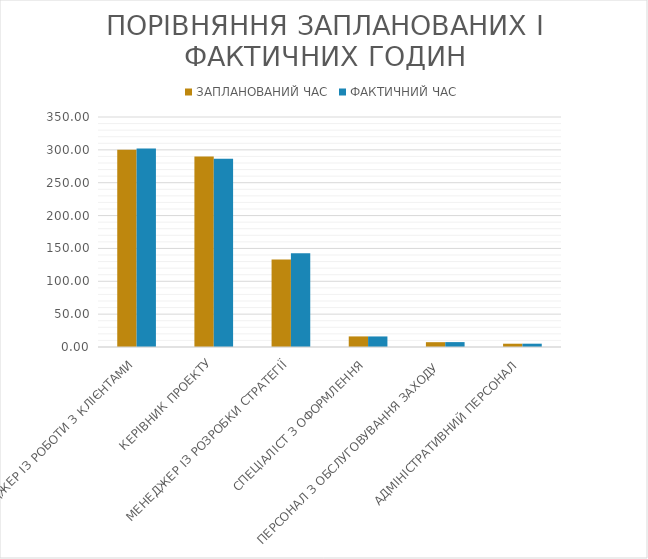
| Category | ЗАПЛАНОВАНИЙ ЧАС | ФАКТИЧНИЙ ЧАС |
|---|---|---|
| МЕНЕДЖЕР ІЗ РОБОТИ З КЛІЄНТАМИ | 300 | 302 |
| КЕРІВНИК ПРОЕКТУ | 290 | 286.333 |
| МЕНЕДЖЕР ІЗ РОЗРОБКИ СТРАТЕГІЇ | 133.333 | 142.5 |
| СПЕЦІАЛІСТ З ОФОРМЛЕННЯ | 16.111 | 16.056 |
| ПЕРСОНАЛ З ОБСЛУГОВУВАННЯ ЗАХОДУ | 7.333 | 7.444 |
| АДМІНІСТРАТИВНИЙ ПЕРСОНАЛ | 5 | 5.033 |